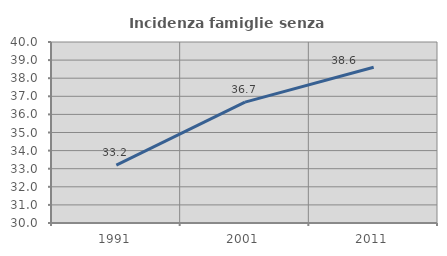
| Category | Incidenza famiglie senza nuclei |
|---|---|
| 1991.0 | 33.197 |
| 2001.0 | 36.678 |
| 2011.0 | 38.602 |